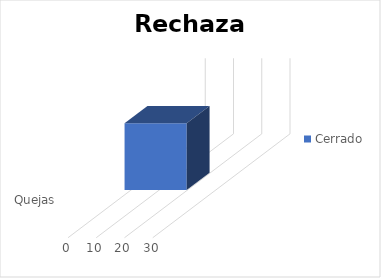
| Category | Cerrado |
|---|---|
| Quejas | 22 |